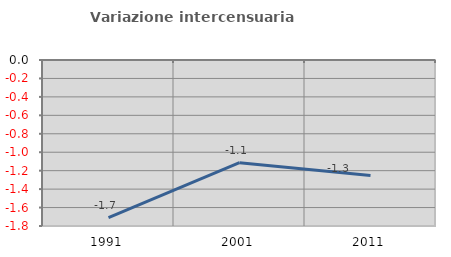
| Category | Variazione intercensuaria annua |
|---|---|
| 1991.0 | -1.71 |
| 2001.0 | -1.113 |
| 2011.0 | -1.252 |